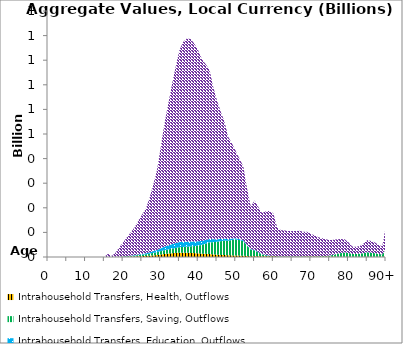
| Category | Intrahousehold Transfers, Health, Outflows | Intrahousehold Transfers, Saving, Outflows | Intrahousehold Transfers, Education, Outflows | Intrahousehold Transfers, Consumption other than health and education, Outflows |
|---|---|---|---|---|
| 0 | 0 | 0 | 0 | 0 |
|  | 0 | 0 | 0 | 0 |
| 2 | 0 | 0 | 0 | 0 |
| 3 | 0 | 0 | 0 | 0 |
| 4 | 0 | 0 | 0 | 0 |
| 5 | 0 | 0 | 0 | 0 |
| 6 | 0 | 0 | 0 | 0 |
| 7 | 0 | 0 | 0 | 0 |
| 8 | 0 | 0 | 0 | 0 |
| 9 | 0 | 0 | 0 | 0 |
| 10 | 0 | 0 | 0 | 0 |
| 11 | 0 | 0 | 0 | 0 |
| 12 | 0 | 0 | 0 | 0 |
| 13 | 0 | 0 | 0 | 0 |
| 14 | 0 | 0 | 0 | 0 |
| 15 | 0 | 0 | 0 | 0 |
| 16 | 0.019 | 0 | 0.222 | 13.397 |
| 17 | 0.088 | 0.151 | 0.058 | 3.84 |
| 18 | 0.322 | 0.085 | 0.12 | 17.467 |
| 19 | 0.712 | 0.312 | 0.25 | 38.482 |
| 20 | 1.077 | 0.852 | 0.642 | 56.616 |
| 21 | 1.484 | 1.613 | 1.036 | 75.698 |
| 22 | 1.918 | 2.367 | 1.418 | 94.126 |
| 23 | 2.335 | 3.271 | 1.858 | 111.746 |
| 24 | 2.9 | 4.582 | 2.517 | 135.87 |
| 25 | 3.477 | 5.661 | 3.223 | 159.162 |
| 26 | 4.028 | 6.74 | 3.999 | 179.351 |
| 27 | 5.101 | 8.454 | 5.366 | 219.807 |
| 28 | 6.396 | 10.246 | 7.05 | 268.871 |
| 29 | 7.833 | 11.702 | 8.975 | 323.306 |
| 30 | 10.007 | 13.844 | 11.736 | 409.183 |
| 31 | 12.205 | 15.484 | 14.446 | 498.982 |
| 32 | 13.846 | 16.766 | 16.571 | 573.744 |
| 33 | 15.347 | 18.448 | 18.496 | 649.082 |
| 34 | 16.55 | 20.146 | 19.863 | 717.19 |
| 35 | 17.455 | 22.422 | 20.928 | 780.869 |
| 36 | 17.514 | 23.507 | 20.94 | 812.366 |
| 37 | 17.224 | 24.576 | 20.533 | 825.99 |
| 38 | 16.632 | 26.45 | 19.671 | 823.021 |
| 39 | 15.726 | 28.757 | 18.604 | 803.318 |
| 40 | 14.752 | 31.556 | 17.404 | 775.904 |
| 41 | 13.631 | 36.073 | 16.054 | 737.641 |
| 42 | 12.8 | 41.585 | 14.954 | 714.403 |
| 43 | 11.966 | 47.451 | 13.864 | 688.612 |
| 44 | 10.509 | 49.774 | 11.921 | 618.769 |
| 45 | 9.395 | 52.51 | 10.365 | 563.73 |
| 46 | 8.508 | 55.713 | 9.084 | 517.449 |
| 47 | 7.831 | 58.884 | 7.97 | 475.362 |
| 48 | 6.938 | 58.841 | 6.592 | 415.396 |
| 49 | 6.541 | 62.866 | 5.754 | 386.61 |
| 50 | 6.05 | 64.966 | 4.918 | 354.202 |
| 51 | 5.68 | 62.998 | 4.186 | 326.669 |
| 52 | 5.236 | 59.687 | 3.543 | 300.117 |
| 53 | 3.967 | 42.119 | 2.546 | 229.756 |
| 54 | 2.973 | 27.157 | 1.813 | 173.01 |
| 55 | 3.491 | 23.365 | 1.997 | 201.022 |
| 56 | 3.206 | 15.29 | 1.716 | 183.507 |
| 57 | 2.975 | 7.176 | 1.464 | 166.872 |
| 58 | 3.263 | 3.782 | 1.425 | 177.285 |
| 59 | 3.453 | 0.867 | 1.327 | 181.578 |
| 60 | 3.399 | 0.417 | 1.145 | 172.653 |
| 61 | 2.419 | 0 | 0.712 | 118.387 |
| 62 | 2.247 | 0 | 0.561 | 106.09 |
| 63 | 2.307 | 0 | 0.493 | 105.324 |
| 64 | 2.304 | 0 | 0.438 | 102.645 |
| 65 | 2.336 | 0 | 0.404 | 102.397 |
| 66 | 2.365 | 0 | 0.386 | 103.174 |
| 67 | 2.379 | 0.05 | 0.37 | 103.636 |
| 68 | 2.299 | 0.1 | 0.349 | 99.873 |
| 69 | 2.273 | 0.502 | 0.339 | 99.089 |
| 70 | 2.086 | 0.869 | 0.312 | 90.588 |
| 71 | 1.974 | 1.235 | 0.296 | 84.405 |
| 72 | 1.818 | 1.455 | 0.282 | 76.87 |
| 73 | 1.729 | 2.009 | 0.274 | 72.574 |
| 74 | 1.66 | 2.381 | 0.241 | 67.833 |
| 75 | 1.55 | 4.258 | 0.219 | 62.479 |
| 76 | 1.527 | 7.315 | 0.234 | 60.782 |
| 77 | 1.499 | 11.389 | 0.273 | 58.939 |
| 78 | 1.431 | 14.758 | 0.325 | 56.542 |
| 79 | 1.341 | 17.124 | 0.375 | 53.151 |
| 80 | 1.084 | 15.648 | 0.354 | 42.547 |
| 81 | 0.756 | 11.582 | 0.266 | 29.888 |
| 82 | 0.74 | 11.337 | 0.267 | 29.063 |
| 83 | 0.819 | 12.154 | 0.287 | 31.214 |
| 84 | 1.025 | 14.59 | 0.346 | 38.283 |
| 85 | 1.336 | 17.629 | 0.421 | 48.993 |
| 86 | 1.327 | 16.138 | 0.384 | 47.204 |
| 87 | 1.267 | 14.233 | 0.334 | 43.881 |
| 88 | 1.083 | 11.309 | 0.26 | 36.66 |
| 89 | 0.989 | 9.66 | 0.216 | 32.679 |
| 90+ | 3.014 | 27.656 | 0.602 | 97.428 |